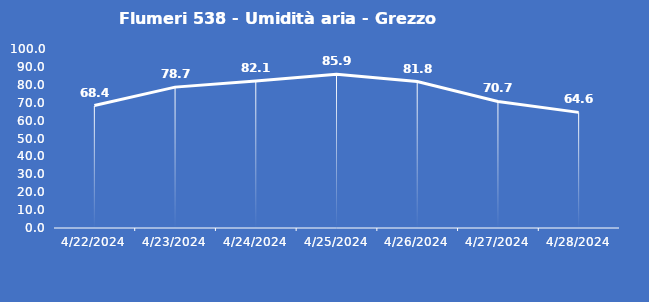
| Category | Flumeri 538 - Umidità aria - Grezzo (%) |
|---|---|
| 4/22/24 | 68.4 |
| 4/23/24 | 78.7 |
| 4/24/24 | 82.1 |
| 4/25/24 | 85.9 |
| 4/26/24 | 81.8 |
| 4/27/24 | 70.7 |
| 4/28/24 | 64.6 |